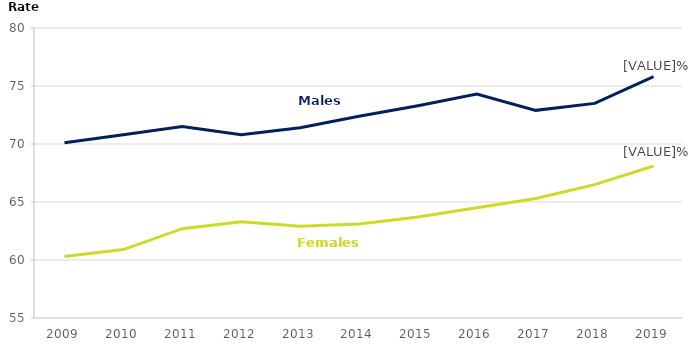
| Category | Male | Female |
|---|---|---|
| 2009.0 | 70.1 | 60.3 |
| 2010.0 | 70.8 | 60.9 |
| 2011.0 | 71.5 | 62.7 |
| 2012.0 | 70.8 | 63.3 |
| 2013.0 | 71.4 | 62.9 |
| 2014.0 | 72.4 | 63.1 |
| 2015.0 | 73.3 | 63.7 |
| 2016.0 | 74.3 | 64.5 |
| 2017.0 | 72.9 | 65.3 |
| 2018.0 | 73.5 | 66.5 |
| 2019.0 | 75.8 | 68.1 |